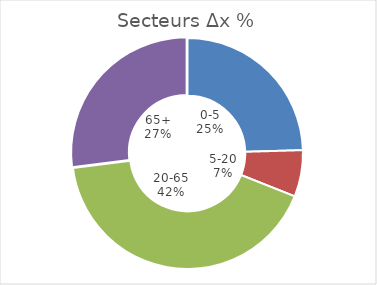
| Category | Secteurs |
|---|---|
| 0-5 | 0.245 |
| 5-20 | 0.065 |
| 20-65 | 0.419 |
| 65+ | 0.27 |